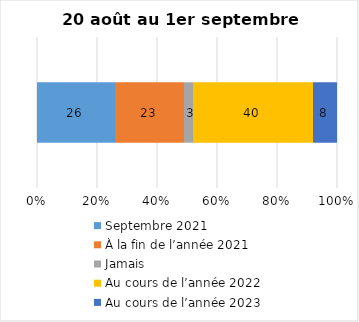
| Category | Septembre 2021 | À la fin de l’année 2021 | Jamais | Au cours de l’année 2022 | Au cours de l’année 2023 |
|---|---|---|---|---|---|
| 0 | 26 | 23 | 3 | 40 | 8 |